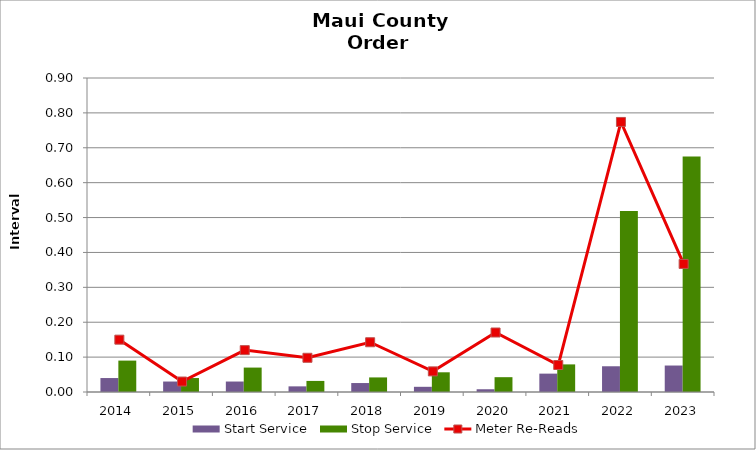
| Category | Start Service | Stop Service |
|---|---|---|
| 2014.0 | 0.04 | 0.09 |
| 2015.0 | 0.03 | 0.04 |
| 2016.0 | 0.03 | 0.07 |
| 2017.0 | 0.016 | 0.032 |
| 2018.0 | 0.026 | 0.042 |
| 2019.0 | 0.015 | 0.056 |
| 2020.0 | 0.008 | 0.042 |
| 2021.0 | 0.053 | 0.079 |
| 2022.0 | 0.074 | 0.519 |
| 2023.0 | 0.076 | 0.675 |